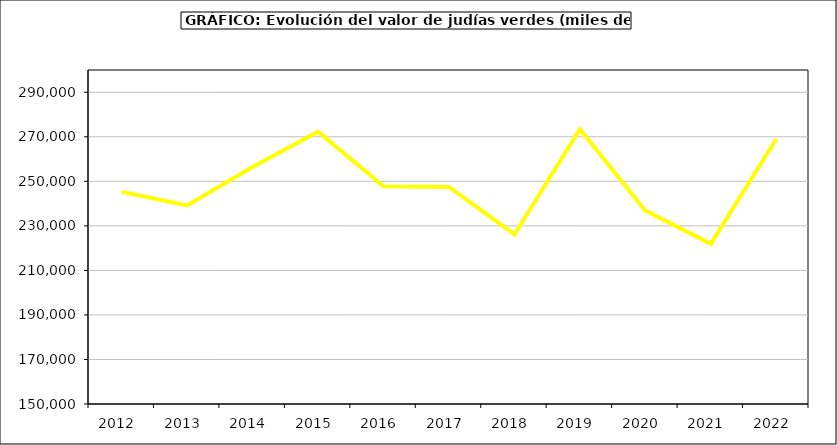
| Category | Valor |
|---|---|
| 2012.0 | 245279.866 |
| 2013.0 | 239211.036 |
| 2014.0 | 256441.694 |
| 2015.0 | 272296 |
| 2016.0 | 247800 |
| 2017.0 | 247502.748 |
| 2018.0 | 226142.115 |
| 2019.0 | 273438.399 |
| 2020.0 | 236840.402 |
| 2021.0 | 221942.842 |
| 2022.0 | 269018.01 |